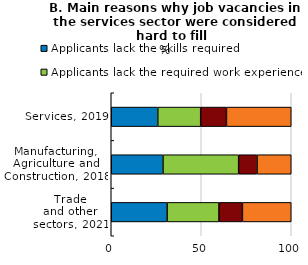
| Category | Applicants lack the skills required | Applicants lack the required work experience | Applicants lack the education background required | Others |
|---|---|---|---|---|
| Services, 2019 | 25.851 | 23.844 | 14.305 | 36 |
| Manufacturing,
Agriculture and
Construction, 2018 | 28.75 | 42.024 | 10.238 | 18.988 |
| Trade
and other
sectors, 2021 | 31.032 | 28.823 | 13.016 | 27.129 |